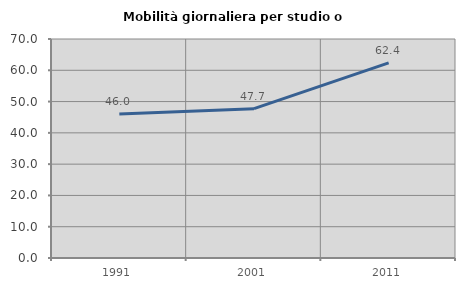
| Category | Mobilità giornaliera per studio o lavoro |
|---|---|
| 1991.0 | 46 |
| 2001.0 | 47.727 |
| 2011.0 | 62.376 |